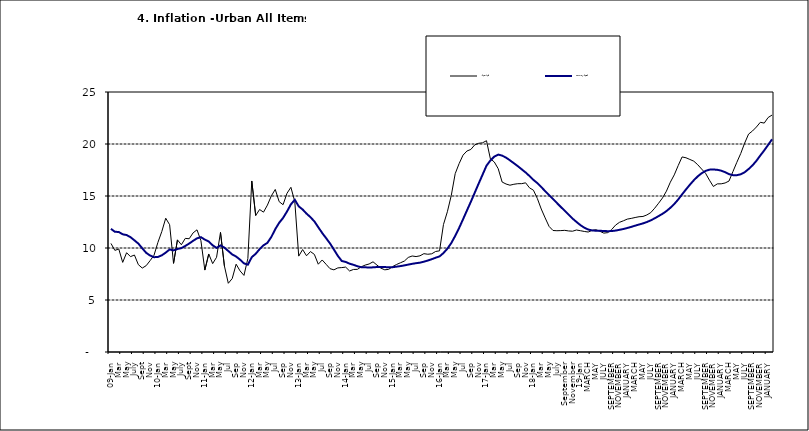
| Category | Year-on Rate | 12-Month Average |
|---|---|---|
| 09-Jan | 10.439 | 11.844 |
| Feb | 9.772 | 11.562 |
| Mar | 9.907 | 11.538 |
| Apr | 8.618 | 11.319 |
| May | 9.547 | 11.246 |
| June | 9.17 | 11.039 |
| July | 9.325 | 10.738 |
| Aug | 8.401 | 10.424 |
| Sept | 8.07 | 9.973 |
| Oct | 8.3 | 9.535 |
| Nov | 8.781 | 9.278 |
| Dec | 9.298 | 9.117 |
| 10-Jan | 10.534 | 9.136 |
| Feb | 11.584 | 9.297 |
| Mar | 12.864 | 9.555 |
| Apr | 12.24 | 9.859 |
| May | 8.524 | 9.769 |
| June | 10.781 | 9.904 |
| July | 10.313 | 9.987 |
| Aug | 10.924 | 10.197 |
| Sept | 10.891 | 10.43 |
| Oct | 11.457 | 10.689 |
| Nov | 11.748 | 10.932 |
| Dec | 10.699 | 11.042 |
| 11-Jan | 7.878 | 10.806 |
| Feb | 9.426 | 10.623 |
| Mar | 8.498 | 10.26 |
| Apr | 9.11 | 10.005 |
| May | 11.5 | 10.249 |
| Jun | 8.278 | 10.034 |
| Jul | 6.608 | 9.711 |
| Aug | 7.061 | 9.38 |
| Sep | 8.443 | 9.178 |
| Oct | 7.802 | 8.88 |
| Nov | 7.365 | 8.525 |
| Dec | 8.993 | 8.395 |
| 12-Jan | 16.445 | 9.119 |
| Feb | 13.123 | 9.443 |
| Mar | 13.701 | 9.889 |
| Apr | 13.447 | 10.259 |
| May | 14.127 | 10.496 |
| Jun | 15.012 | 11.062 |
| Jul | 15.63 | 11.81 |
| Aug | 14.456 | 12.422 |
| Sep | 14.162 | 12.893 |
| Oct | 15.26 | 13.506 |
| Nov | 15.836 | 14.199 |
| Dec | 14.459 | 14.637 |
| 13-Jan | 9.22 | 14.006 |
| Feb | 9.85 | 13.703 |
| Mar | 9.253 | 13.302 |
| Apr | 9.657 | 12.966 |
| May | 9.385 | 12.557 |
| Jun | 8.441 | 11.999 |
| Jul | 8.849 | 11.443 |
| Aug | 8.431 | 10.946 |
| Sep | 8.013 | 10.44 |
| Oct | 7.9 | 9.849 |
| Nov | 8.086 | 9.245 |
| Dec | 8.117 | 8.75 |
| 14-Jan | 8.164 | 8.662 |
| Feb | 7.791 | 8.493 |
| Mar | 7.937 | 8.384 |
| Apr | 7.947 | 8.246 |
| May | 8.195 | 8.151 |
| Jun | 8.358 | 8.146 |
| Jul | 8.464 | 8.118 |
| Aug | 8.673 | 8.141 |
| Sep | 8.357 | 8.17 |
| Oct | 8.064 | 8.182 |
| Nov | 7.902 | 8.165 |
| Dec | 7.948 | 8.151 |
| 15-Jan | 8.211 | 8.155 |
| Feb | 8.412 | 8.206 |
| Mar | 8.579 | 8.26 |
| Apr | 8.742 | 8.326 |
| May | 9.092 | 8.403 |
| Jun | 9.232 | 8.478 |
| Jul | 9.177 | 8.54 |
| Aug | 9.25 | 8.591 |
| Sep | 9.455 | 8.684 |
| Oct | 9.398 | 8.795 |
| Nov | 9.442 | 8.922 |
| Dec | 9.665 | 9.064 |
| 16-Jan | 9.728 | 9.19 |
| Feb | 12.254 | 9.516 |
| Mar | 13.485 | 9.935 |
| Apr | 15.052 | 10.474 |
| May | 17.148 | 11.165 |
| Jun | 18.111 | 11.925 |
| Jul | 18.927 | 12.754 |
| Aug | 19.325 | 13.605 |
| Sep | 19.476 | 14.444 |
| Oct | 19.914 | 15.318 |
| Nov | 20.067 | 16.193 |
| Dec | 20.118 | 17.05 |
| 17-Jan | 20.315 | 17.914 |
| Feb | 18.569 | 18.418 |
| Mar | 18.27 | 18.794 |
| Apr | 17.621 | 18.982 |
| May | 16.343 | 18.883 |
| Jun | 16.153 | 18.692 |
| Jul | 16.038 | 18.43 |
| Aug | 16.128 | 18.151 |
| Sep | 16.183 | 17.872 |
| Oct | 16.187 | 17.567 |
| Nov | 16.267 | 17.264 |
| Dec | 15.785 | 16.921 |
| 18-Jan | 15.559 | 16.55 |
| Feb | 14.763 | 16.241 |
| Mar | 13.748 | 15.866 |
| Apr | 12.893 | 15.468 |
| May | 12.077 | 15.096 |
| June | 11.683 | 14.706 |
| July | 11.661 | 14.329 |
| August | 11.673 | 13.951 |
| September | 11.697 | 13.578 |
| October | 11.64 | 13.206 |
| November | 11.615 | 12.831 |
| December | 11.731 | 12.509 |
| 19-Jan | 11.664 | 12.203 |
| February | 11.592 | 11.954 |
| MARCH | 11.535 | 11.78 |
| APRIL | 11.696 | 11.686 |
| MAY | 11.756 | 11.662 |
| JUNE | 11.605 | 11.655 |
| JULY | 11.432 | 11.635 |
| AUGUST | 11.479 | 11.618 |
| SEPTEMBER | 11.776 | 11.626 |
| OCTOBER | 12.202 | 11.676 |
| NOVEMBER | 12.469 | 11.75 |
| DECEMBER | 12.617 | 11.827 |
| JANUARY | 12.779 | 11.923 |
| FEBRUARY | 12.847 | 12.03 |
| MARCH | 12.932 | 12.147 |
| APRIL | 13.008 | 12.258 |
| MAY | 13.033 | 12.365 |
| JUNE | 13.178 | 12.496 |
| JULY | 13.403 | 12.659 |
| AUGUST | 13.827 | 12.855 |
| SEPTEMBER | 14.306 | 13.068 |
| OCTOBER | 14.811 | 13.289 |
| NOVEMBER | 15.466 | 13.546 |
| DECEMBER | 16.327 | 13.864 |
| JANUARY | 17.03 | 14.228 |
| FEBRUARY | 17.918 | 14.66 |
| MARCH | 18.756 | 15.154 |
| APRIL | 18.675 | 15.63 |
| MAY | 18.514 | 16.086 |
| JUNE | 18.348 | 16.512 |
| JULY | 18.007 | 16.886 |
| AUGUST | 17.59 | 17.187 |
| SEPTEMBER | 17.187 | 17.411 |
| OCTOBER | 16.52 | 17.534 |
| NOVEMBER | 15.916 | 17.55 |
| DECEMBER | 16.165 | 17.519 |
| JANUARY | 16.171 | 17.435 |
| FEBRUARY | 16.253 | 17.292 |
| MARCH | 16.438 | 17.103 |
| APRIL | 17.347 | 17.005 |
| MAY | 18.24 | 17.002 |
| JUNE | 19.093 | 17.087 |
| JULY | 20.087 | 17.285 |
| AUGUST | 20.954 | 17.588 |
| SEPTEMBER | 21.251 | 17.944 |
| OCTOBER | 21.632 | 18.379 |
| NOVEMBER | 22.086 | 18.896 |
| DECEMBER | 22.011 | 19.382 |
| JANUARY | 22.548 | 19.912 |
| FEBRUARY | 22.782 | 20.451 |